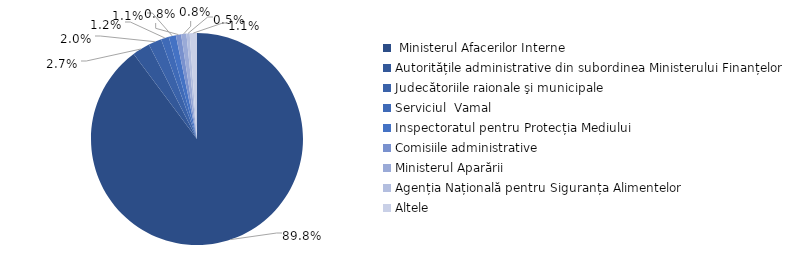
| Category | Series 0 |
|---|---|
|  Ministerul Afacerilor Interne | 0.898 |
| Autoritățile administrative din subordinea Ministerului Finanțelor | 0.027 |
| Judecătoriile raionale şi municipale | 0.02 |
| Serviciul  Vamal | 0.012 |
| Inspectoratul pentru Protecția Mediului | 0.011 |
| Comisiile administrative | 0.008 |
| Ministerul Aparării | 0.008 |
| Agenția Națională pentru Siguranța Alimentelor | 0.005 |
| Altele | 0.011 |